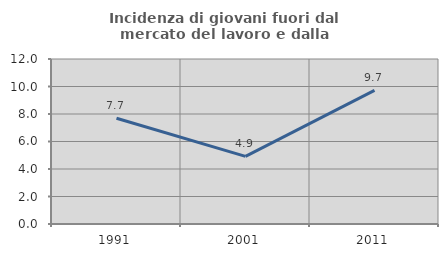
| Category | Incidenza di giovani fuori dal mercato del lavoro e dalla formazione  |
|---|---|
| 1991.0 | 7.692 |
| 2001.0 | 4.918 |
| 2011.0 | 9.722 |